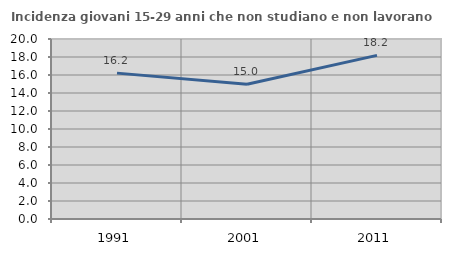
| Category | Incidenza giovani 15-29 anni che non studiano e non lavorano  |
|---|---|
| 1991.0 | 16.209 |
| 2001.0 | 14.966 |
| 2011.0 | 18.182 |